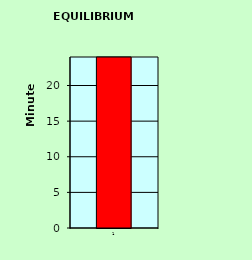
| Category | Series 0 |
|---|---|
| 0 | 4376.238 |